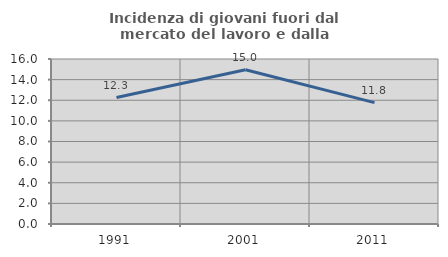
| Category | Incidenza di giovani fuori dal mercato del lavoro e dalla formazione  |
|---|---|
| 1991.0 | 12.261 |
| 2001.0 | 14.96 |
| 2011.0 | 11.772 |